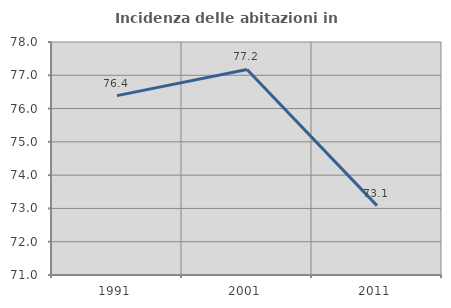
| Category | Incidenza delle abitazioni in proprietà  |
|---|---|
| 1991.0 | 76.389 |
| 2001.0 | 77.174 |
| 2011.0 | 73.084 |